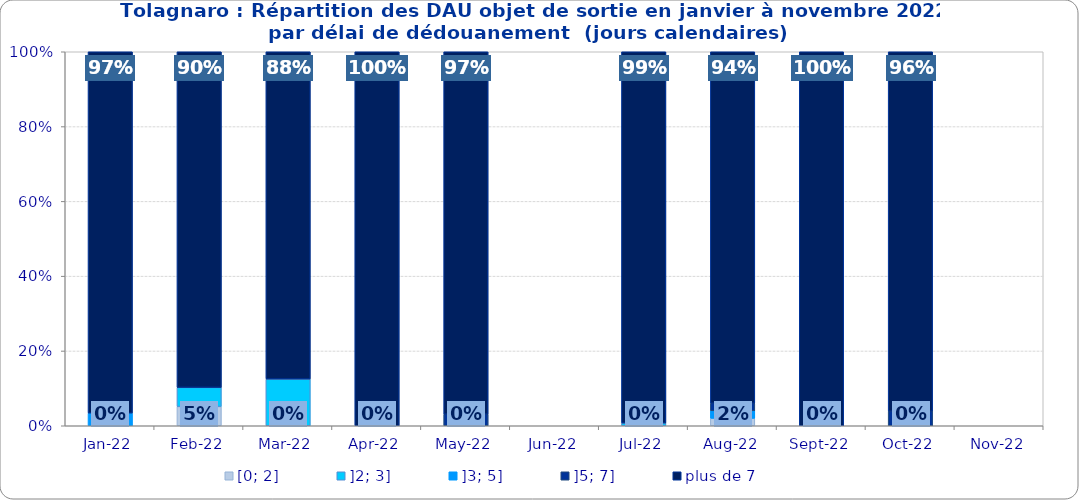
| Category | [0; 2] | ]2; 3] | ]3; 5] | ]5; 7] | plus de 7 |
|---|---|---|---|---|---|
| 2022-01-01 | 0 | 0 | 0.034 | 0 | 0.966 |
| 2022-02-01 | 0.051 | 0.051 | 0 | 0 | 0.897 |
| 2022-03-01 | 0 | 0.125 | 0 | 0 | 0.875 |
| 2022-04-01 | 0 | 0 | 0 | 0 | 1 |
| 2022-05-01 | 0 | 0 | 0 | 0.031 | 0.969 |
| 2022-06-01 | 0 | 0 | 0 | 0 | 0 |
| 2022-07-01 | 0 | 0.007 | 0 | 0 | 0.993 |
| 2022-08-01 | 0.02 | 0 | 0.02 | 0.02 | 0.94 |
| 2022-09-01 | 0 | 0 | 0 | 0 | 1 |
| 2022-10-01 | 0 | 0 | 0 | 0.039 | 0.961 |
| 2022-11-01 | 0 | 0 | 0 | 0 | 0 |